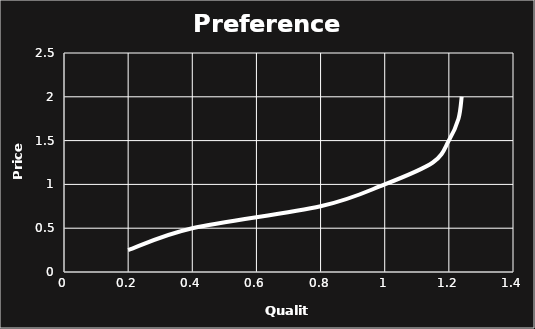
| Category | Preference curve |
|---|---|
| 0.2 | 0.25 |
| 0.4 | 0.5 |
| 0.8 | 0.75 |
| 1.0 | 1 |
| 1.15 | 1.25 |
| 1.2 | 1.5 |
| 1.23 | 1.75 |
| 1.24 | 2 |